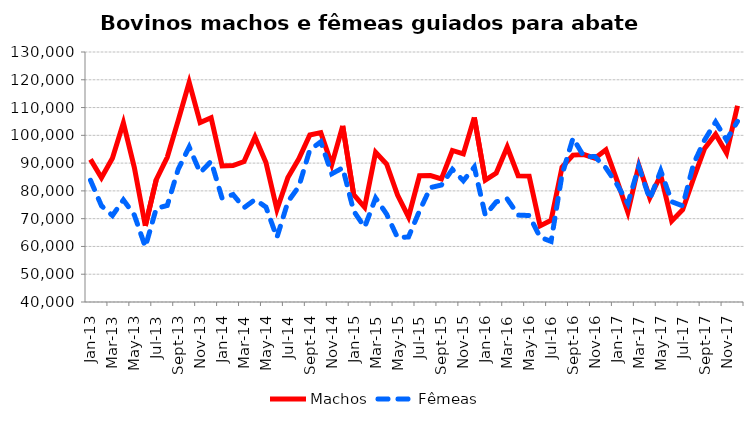
| Category | Machos | Fêmeas |
|---|---|---|
| 2013-01-01 | 91340 | 83829 |
| 2013-02-01 | 84729 | 74643 |
| 2013-03-01 | 91791 | 71120 |
| 2013-04-01 | 104486 | 76763 |
| 2013-05-01 | 88388 | 71294 |
| 2013-06-01 | 67408 | 59805 |
| 2013-07-01 | 84073 | 73707 |
| 2013-08-01 | 92085 | 74744 |
| 2013-09-01 | 105392 | 87802 |
| 2013-10-01 | 119092 | 95797 |
| 2013-11-01 | 104580 | 86568 |
| 2013-12-01 | 106330 | 90644 |
| 2014-01-01 | 88990 | 77351 |
| 2014-02-01 | 89096 | 78677 |
| 2014-03-01 | 90531 | 73947 |
| 2014-04-01 | 99381 | 76859 |
| 2014-05-01 | 90223 | 74188 |
| 2014-06-01 | 73298 | 63231 |
| 2014-07-01 | 84783 | 76066 |
| 2014-08-01 | 91574 | 81591 |
| 2014-09-01 | 100128 | 94740 |
| 2014-10-01 | 100965 | 97662 |
| 2014-11-01 | 89469 | 86144 |
| 2014-12-01 | 103413 | 88294 |
| 2015-01-01 | 78631 | 72710 |
| 2015-02-01 | 74092 | 66940 |
| 2015-03-01 | 93928 | 77440 |
| 2015-04-01 | 89687 | 71651 |
| 2015-05-01 | 78484 | 63160 |
| 2015-06-01 | 70605 | 63421 |
| 2015-07-01 | 85433 | 72791 |
| 2015-08-01 | 85522 | 81195 |
| 2015-09-01 | 84280 | 82108 |
| 2015-10-01 | 94543 | 87740 |
| 2015-11-01 | 93291 | 83641 |
| 2015-12-01 | 106425 | 88578 |
| 2016-01-01 | 83889 | 71250 |
| 2016-02-01 | 86425 | 76048 |
| 2016-03-01 | 95800 | 77091 |
| 2016-04-01 | 85464 | 71291 |
| 2016-05-01 | 85320 | 71132 |
| 2016-06-01 | 67410 | 63314 |
| 2016-07-01 | 69442 | 61818 |
| 2016-08-01 | 88546 | 85833 |
| 2016-09-01 | 92878 | 98990 |
| 2016-10-01 | 93098 | 92303 |
| 2016-11-01 | 91779 | 92346 |
| 2016-12-01 | 94813 | 88244 |
| 2017-01-01 | 83865 | 82411 |
| 2017-02-01 | 72301 | 75442 |
| 2017-03-01 | 89214 | 88822 |
| 2017-04-01 | 77517 | 76998 |
| 2017-05-01 | 85666 | 87242 |
| 2017-06-01 | 69150 | 76101 |
| 2017-07-01 | 73204 | 74609 |
| 2017-08-01 | 84558 | 89832 |
| 2017-09-01 | 95300 | 98339 |
| 2017-10-01 | 100364 | 104811 |
| 2017-11-01 | 93604 | 98318 |
| 2017-12-01 | 110648 | 105019 |